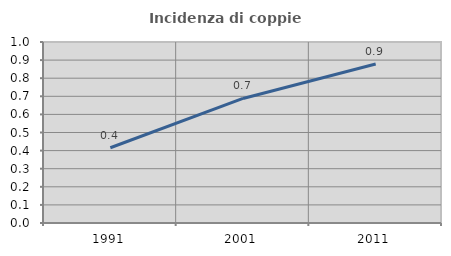
| Category | Incidenza di coppie miste |
|---|---|
| 1991.0 | 0.416 |
| 2001.0 | 0.688 |
| 2011.0 | 0.878 |